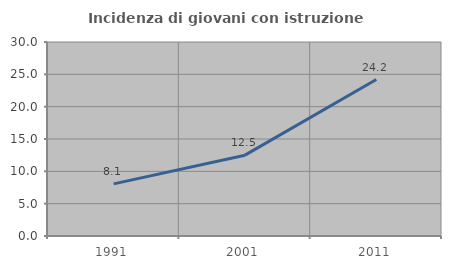
| Category | Incidenza di giovani con istruzione universitaria |
|---|---|
| 1991.0 | 8.062 |
| 2001.0 | 12.5 |
| 2011.0 | 24.197 |